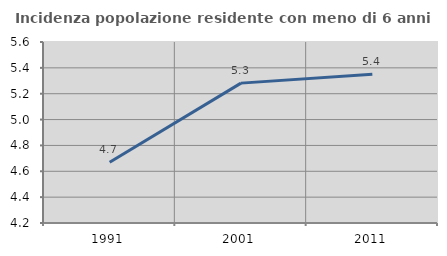
| Category | Incidenza popolazione residente con meno di 6 anni |
|---|---|
| 1991.0 | 4.67 |
| 2001.0 | 5.282 |
| 2011.0 | 5.35 |